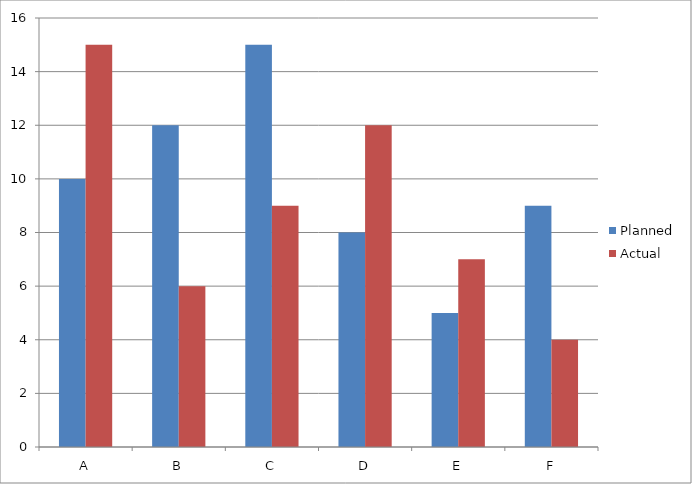
| Category | Planned | Actual |
|---|---|---|
| A | 10 | 15 |
| B | 12 | 6 |
| C | 15 | 9 |
| D | 8 | 12 |
| E | 5 | 7 |
| F | 9 | 4 |